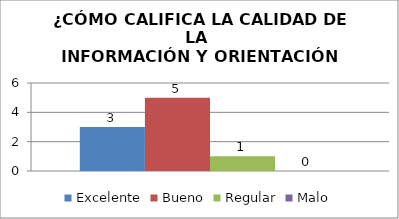
| Category | Excelente | Bueno | Regular | Malo |
|---|---|---|---|---|
| 0 | 3 | 5 | 1 | 0 |